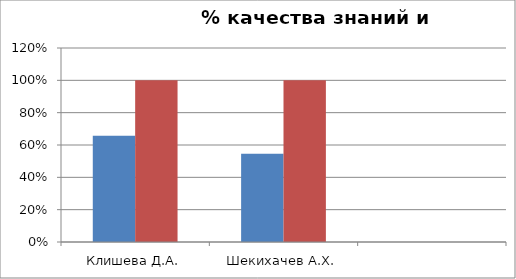
| Category | Series 0 | 2 |
|---|---|---|
| Клишева Д.А. | 0.657 | 1 |
| Шекихачев А.Х. | 0.545 | 1 |